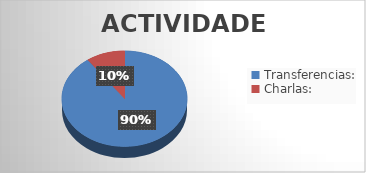
| Category | Series 0 |
|---|---|
| Transferencias: | 9 |
| Charlas:  | 1 |